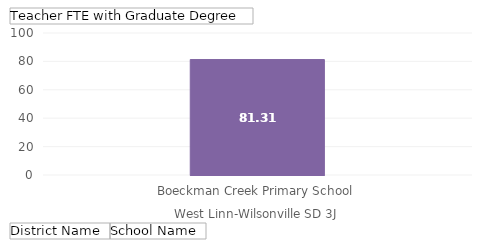
| Category | Total |
|---|---|
| 0 | 81.31 |